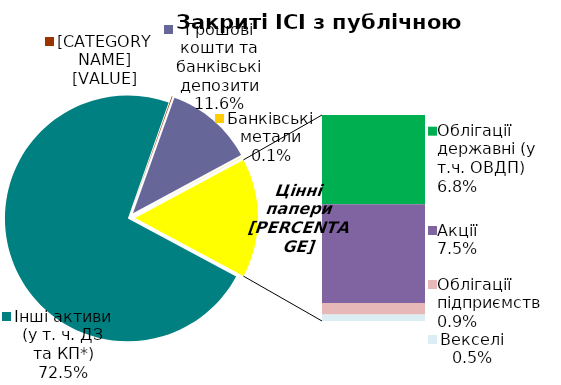
| Category | Series 0 |
|---|---|
| Інші активи (у т. ч. ДЗ та КП*) | 0.725 |
| Нерухомість | 0.001 |
| Грошові кошти та банківські депозити | 0.116 |
| Банківські метали | 0.001 |
| Облігації державні (у т.ч. ОВДП) | 0.068 |
| Облігації місцевих позик | 0 |
| Акції | 0.075 |
| Облігації підприємств | 0.009 |
| Векселі | 0.005 |